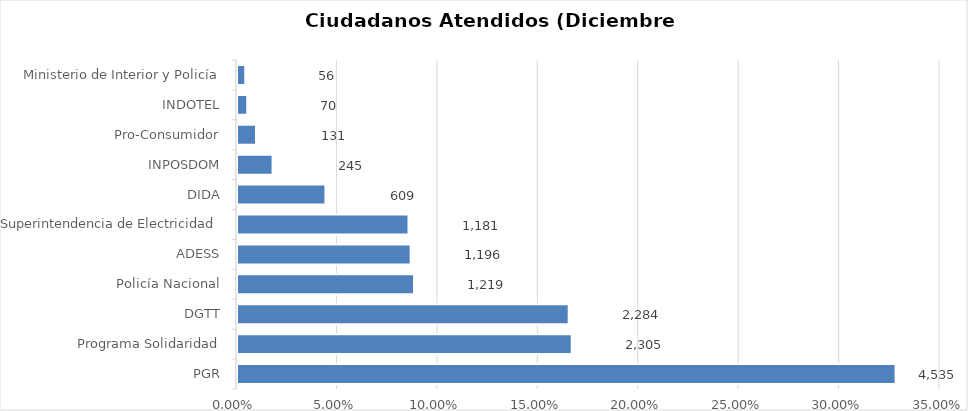
| Category | Porcentaje |
|---|---|
| PGR | 0.328 |
| Programa Solidaridad | 0.167 |
| DGTT | 0.165 |
| Policía Nacional | 0.088 |
| ADESS | 0.086 |
| Superintendencia de Electricidad | 0.085 |
| DIDA | 0.044 |
| INPOSDOM | 0.018 |
| Pro-Consumidor | 0.009 |
| INDOTEL | 0.005 |
| Ministerio de Interior y Policía | 0.004 |